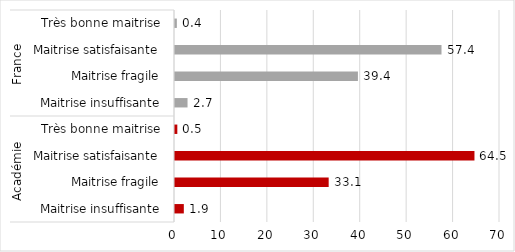
| Category | Series 0 |
|---|---|
| 0 | 1.9 |
| 1 | 33.1 |
| 2 | 64.5 |
| 3 | 0.5 |
| 4 | 2.7 |
| 5 | 39.4 |
| 6 | 57.4 |
| 7 | 0.4 |